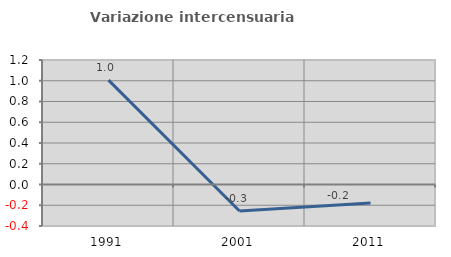
| Category | Variazione intercensuaria annua |
|---|---|
| 1991.0 | 1.007 |
| 2001.0 | -0.255 |
| 2011.0 | -0.178 |